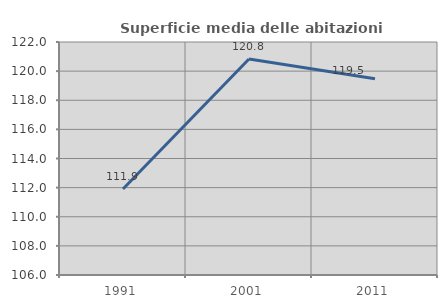
| Category | Superficie media delle abitazioni occupate |
|---|---|
| 1991.0 | 111.91 |
| 2001.0 | 120.836 |
| 2011.0 | 119.473 |